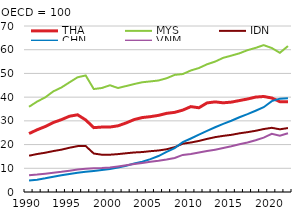
| Category | THA | MYS | IDN | CHN | VNM |
|---|---|---|---|---|---|
| 1990.0 | 24.639 | 35.936 | 15.311 | 4.824 | 7.112 |
| 1991.0 | 26.24 | 38.138 | 16.01 | 5.181 | 7.351 |
| 1992.0 | 27.609 | 39.903 | 16.561 | 5.776 | 7.729 |
| 1993.0 | 29.305 | 42.431 | 17.257 | 6.47 | 8.149 |
| 1994.0 | 30.506 | 44.066 | 17.849 | 7.071 | 8.514 |
| 1995.0 | 31.955 | 46.246 | 18.667 | 7.623 | 9.005 |
| 1996.0 | 32.554 | 48.375 | 19.348 | 8.101 | 9.467 |
| 1997.0 | 30.386 | 49.146 | 19.381 | 8.516 | 9.809 |
| 1998.0 | 27.139 | 43.424 | 16.227 | 8.905 | 10.015 |
| 1999.0 | 27.384 | 43.852 | 15.722 | 9.275 | 10.109 |
| 2000.0 | 27.394 | 45.014 | 15.726 | 9.657 | 10.326 |
| 2001.0 | 27.915 | 43.842 | 15.977 | 10.325 | 10.79 |
| 2002.0 | 29.125 | 44.686 | 16.333 | 11.101 | 11.261 |
| 2003.0 | 30.551 | 45.535 | 16.668 | 11.982 | 11.761 |
| 2004.0 | 31.391 | 46.281 | 16.847 | 12.784 | 12.201 |
| 2005.0 | 31.772 | 46.64 | 17.214 | 13.86 | 12.719 |
| 2006.0 | 32.317 | 47.019 | 17.503 | 15.169 | 13.157 |
| 2007.0 | 33.166 | 47.965 | 18.018 | 16.907 | 13.692 |
| 2008.0 | 33.584 | 49.387 | 18.91 | 18.497 | 14.367 |
| 2009.0 | 34.536 | 49.734 | 20.374 | 21 | 15.632 |
| 2010.0 | 36.005 | 51.248 | 20.865 | 22.572 | 16.068 |
| 2011.0 | 35.518 | 52.28 | 21.538 | 24.214 | 16.656 |
| 2012.0 | 37.57 | 53.861 | 22.388 | 25.752 | 17.259 |
| 2013.0 | 37.998 | 54.997 | 23.135 | 27.318 | 17.859 |
| 2014.0 | 37.613 | 56.576 | 23.668 | 28.742 | 18.533 |
| 2015.0 | 37.903 | 57.502 | 24.099 | 30.029 | 19.264 |
| 2016.0 | 38.56 | 58.475 | 24.743 | 31.517 | 20.101 |
| 2017.0 | 39.217 | 59.801 | 25.23 | 32.843 | 20.869 |
| 2018.0 | 40.016 | 60.777 | 25.813 | 34.275 | 21.823 |
| 2019.0 | 40.276 | 61.934 | 26.537 | 35.757 | 22.943 |
| 2020.0 | 39.644 | 60.719 | 27.069 | 38.307 | 24.565 |
| 2021.0 | 38.086 | 58.695 | 26.434 | 39.357 | 23.69 |